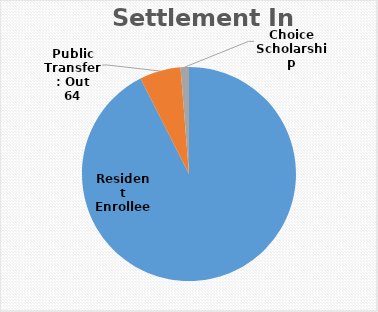
| Category | Series 0 |
|---|---|
| Resident Enrollee | 952 |
| Public Transfer: Out | 64 |
| Choice Scholarship | 13 |